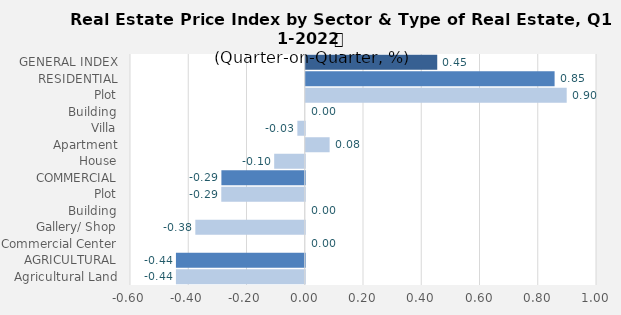
| Category | Q4-2021 |
|---|---|
| GENERAL INDEX | 0.451 |
| RESIDENTIAL | 0.854 |
| Plot | 0.896 |
| Building | 0 |
| Villa | -0.025 |
| Apartment | 0.082 |
| House | -0.105 |
| COMMERCIAL | -0.286 |
| Plot | -0.287 |
| Building | 0 |
| Gallery/ Shop | -0.376 |
| Commercial Center | 0 |
| AGRICULTURAL | -0.442 |
| Agricultural Land | -0.442 |